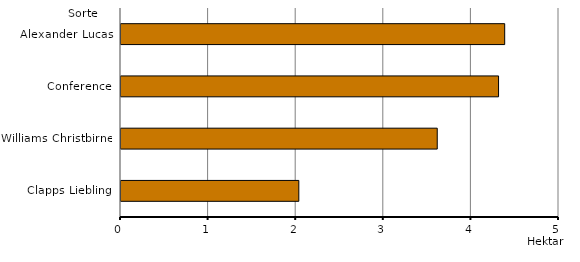
| Category | Series 0 |
|---|---|
| Alexander Lucas | 4.38 |
| Conference | 4.31 |
| Williams Christbirne | 3.61 |
| Clapps Liebling | 2.03 |